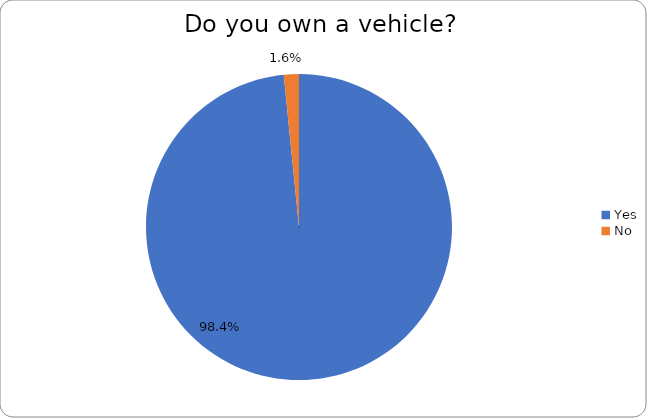
| Category | Series 0 |
|---|---|
| Yes | 0.984 |
| No | 0.016 |